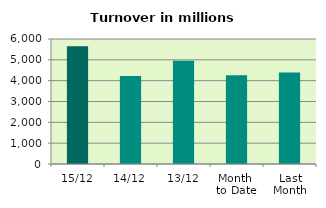
| Category | Series 0 |
|---|---|
| 15/12 | 5654.114 |
| 14/12 | 4228.202 |
| 13/12 | 4959.034 |
| Month 
to Date | 4261.273 |
| Last
Month | 4388.555 |